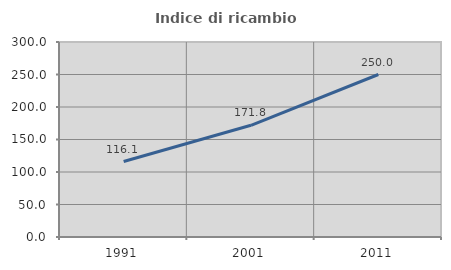
| Category | Indice di ricambio occupazionale  |
|---|---|
| 1991.0 | 116.092 |
| 2001.0 | 171.831 |
| 2011.0 | 250 |